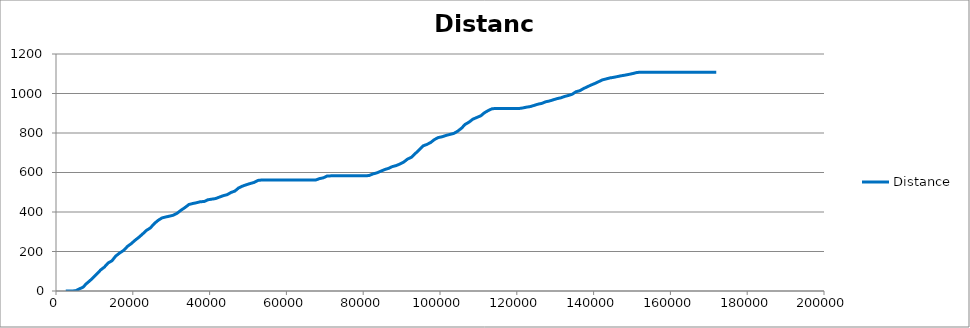
| Category | Distance |
|---|---|
| 2518.0 | 0 |
| 3417.0 | 0 |
| 4316.0 | 0 |
| 5216.0 | 2 |
| 6115.0 | 11 |
| 7014.0 | 19 |
| 7913.0 | 37 |
| 8813.0 | 52 |
| 9712.0 | 68 |
| 10611.0 | 86 |
| 11600.0 | 106 |
| 12590.0 | 121 |
| 13580.0 | 142 |
| 14569.0 | 153 |
| 15558.0 | 177 |
| 16547.0 | 192 |
| 17627.0 | 206 |
| 18616.0 | 226 |
| 19605.0 | 240 |
| 20594.0 | 257 |
| 21583.0 | 272 |
| 22573.0 | 289 |
| 23562.0 | 307 |
| 24551.0 | 319 |
| 25630.0 | 342 |
| 26619.0 | 358 |
| 27609.0 | 370 |
| 28599.0 | 375 |
| 29588.0 | 379 |
| 30577.0 | 384 |
| 31566.0 | 394 |
| 32556.0 | 409 |
| 33545.0 | 422 |
| 34624.0 | 438 |
| 35613.0 | 443 |
| 36602.0 | 447 |
| 37592.0 | 452 |
| 38581.0 | 453 |
| 39570.0 | 462 |
| 40559.0 | 465 |
| 41549.0 | 468 |
| 42628.0 | 476 |
| 43618.0 | 483 |
| 44607.0 | 488 |
| 44607.0 | 493 |
| 45596.0 | 499 |
| 46585.0 | 506 |
| 47575.0 | 522 |
| 48564.0 | 531 |
| 49553.0 | 538 |
| 50542.0 | 544 |
| 51621.0 | 550 |
| 52611.0 | 560 |
| 53600.0 | 562 |
| 54589.0 | 562 |
| 55578.0 | 562 |
| 56567.0 | 562 |
| 57556.0 | 562 |
| 58547.0 | 562 |
| 59625.0 | 562 |
| 60615.0 | 562 |
| 61604.0 | 562 |
| 62594.0 | 562 |
| 63583.0 | 562 |
| 64572.0 | 562 |
| 65561.0 | 562 |
| 66550.0 | 562 |
| 67630.0 | 562 |
| 68619.0 | 569 |
| 69608.0 | 573 |
| 70597.0 | 582 |
| 71586.0 | 583 |
| 72576.0 | 583 |
| 73565.0 | 583 |
| 74554.0 | 583 |
| 75544.0 | 583 |
| 76623.0 | 583 |
| 77613.0 | 583 |
| 78602.0 | 583 |
| 79591.0 | 583 |
| 80580.0 | 583 |
| 81569.0 | 585 |
| 82558.0 | 593 |
| 83548.0 | 598 |
| 84627.0 | 607 |
| 85616.0 | 615 |
| 86605.0 | 621 |
| 87595.0 | 630 |
| 88584.0 | 635 |
| 89573.0 | 643 |
| 90562.0 | 653 |
| 91551.0 | 668 |
| 92540.0 | 677 |
| 93620.0 | 697 |
| 94609.0 | 715 |
| 95599.0 | 735 |
| 96588.0 | 742 |
| 97577.0 | 752 |
| 98567.0 | 767 |
| 99556.0 | 777 |
| 100545.0 | 781 |
| 101624.0 | 788 |
| 102614.0 | 793 |
| 103603.0 | 798 |
| 104593.0 | 809 |
| 105582.0 | 824 |
| 106571.0 | 844 |
| 107560.0 | 855 |
| 108550.0 | 870 |
| 109629.0 | 879 |
| 110618.0 | 887 |
| 111607.0 | 903 |
| 112596.0 | 914 |
| 113586.0 | 923 |
| 114575.0 | 924 |
| 115564.0 | 924 |
| 116553.0 | 924 |
| 117542.0 | 924 |
| 118622.0 | 924 |
| 119611.0 | 924 |
| 120600.0 | 924 |
| 121587.0 | 927 |
| 122574.0 | 931 |
| 123561.0 | 934 |
| 124548.0 | 940 |
| 125535.0 | 946 |
| 126522.0 | 950 |
| 127509.0 | 958 |
| 128496.0 | 962 |
| 129483.0 | 968 |
| 130470.0 | 974 |
| 131457.0 | 978 |
| 132444.0 | 985 |
| 133431.0 | 990 |
| 134418.0 | 996 |
| 135405.0 | 1009 |
| 136392.0 | 1014 |
| 137379.0 | 1025 |
| 138366.0 | 1034 |
| 139353.0 | 1043 |
| 140340.0 | 1051 |
| 141327.0 | 1060 |
| 142314.0 | 1069 |
| 143301.0 | 1074 |
| 144288.0 | 1079 |
| 145275.0 | 1082 |
| 146262.0 | 1086 |
| 147249.0 | 1090 |
| 148236.0 | 1093 |
| 149223.0 | 1097 |
| 150210.0 | 1101 |
| 151197.0 | 1106 |
| 152184.0 | 1108 |
| 153171.0 | 1108 |
| 154158.0 | 1108 |
| 155145.0 | 1108 |
| 156132.0 | 1108 |
| 157119.0 | 1108 |
| 158106.0 | 1108 |
| 159093.0 | 1108 |
| 160080.0 | 1108 |
| 161067.0 | 1108 |
| 162054.0 | 1108 |
| 163041.0 | 1108 |
| 164028.0 | 1108 |
| 165015.0 | 1108 |
| 166002.0 | 1108 |
| 166989.0 | 1108 |
| 167976.0 | 1108 |
| 168963.0 | 1108 |
| 169950.0 | 1108 |
| 170937.0 | 1108 |
| 171924.0 | 1108 |